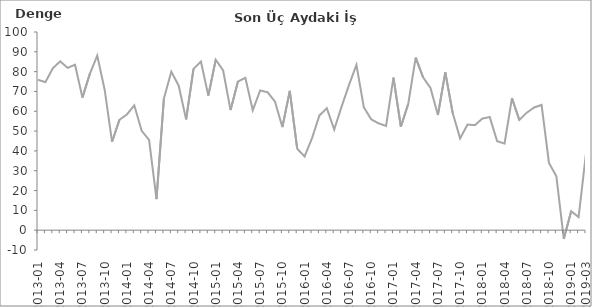
| Category | Denge  |
|---|---|
| 2013-01 | 75.9 |
|  | 74.7 |
|  | 81.7 |
| 2013-04 | 85.2 |
|  | 81.9 |
|  | 83.5 |
| 2013-07 | 66.9 |
|  | 78.9 |
|  | 88.1 |
| 2013-10 | 70.9 |
|  | 44.6 |
|  | 55.7 |
| 2014-01 | 58.4 |
|  | 63 |
|  | 50.1 |
| 2014-04 | 45.6 |
|  | 15.7 |
|  | 66.4 |
| 2014-07 | 80 |
|  | 72.9 |
|  | 55.9 |
| 2014-10 | 81.4 |
|  | 85.1 |
|  | 67.9 |
| 2015-01 | 86 |
|  | 80.6 |
|  | 60.6 |
| 2015-04 | 75 |
|  | 76.9 |
|  | 60.5 |
| 2015-07 | 70.5 |
|  | 69.6 |
|  | 64.9 |
| 2015-10 | 52 |
|  | 70.3 |
|  | 41.1 |
| 2016-01 | 37.2 |
|  | 46.4 |
|  | 57.9 |
| 2016-04 | 61.5 |
|  | 50.8 |
|  | 62.4 |
| 2016-07 | 73.3 |
|  | 83.4 |
|  | 62 |
| 2016-10 | 55.9 |
|  | 53.9 |
|  | 52.6 |
| 2017-01 | 77 |
|  | 52.2 |
|  | 63.8 |
| 2017-04 | 87.1 |
|  | 77.1 |
|  | 71.8 |
| 2017-07 | 58.1 |
|  | 79.6 |
|  | 59.1 |
| 2017-10 | 46.3 |
|  | 53.3 |
|  | 53 |
| 2018-01 | 56.3 |
|  | 57.1 |
|  | 44.9 |
| 2018-04 | 43.7 |
|  | 66.6 |
|  | 55.6 |
| 2018-07 | 59.3 |
|  | 61.9 |
|  | 63.2 |
| 2018-10 | 33.9 |
|  | 27.2 |
|  | -4.4 |
| 2019-01 | 9.6 |
|  | 6.6 |
| 2019-03 | 38.8 |